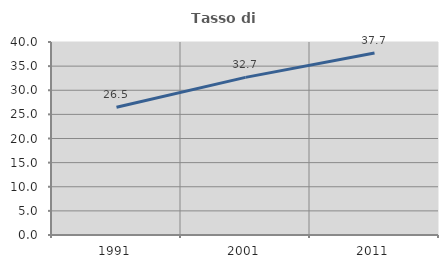
| Category | Tasso di occupazione   |
|---|---|
| 1991.0 | 26.459 |
| 2001.0 | 32.673 |
| 2011.0 | 37.708 |